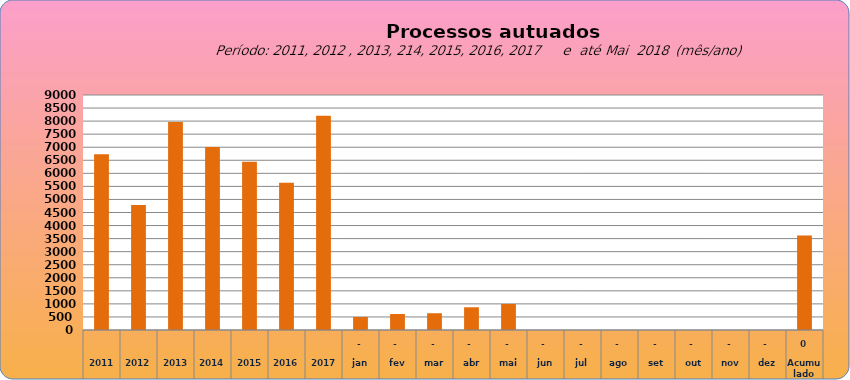
| Category | 6735 |
|---|---|
| 2011 | 6735 |
| 2012 | 4786 |
| 2013 | 7967 |
| 2014 | 7011 |
| 2015 | 6446 |
| 2016 | 5644 |
| 2017 | 8210 |
| jan | 498 |
| fev | 612 |
| mar | 642 |
| abr | 870 |
| mai | 995 |
| jun | 0 |
| jul | 0 |
| ago | 0 |
| set | 0 |
| out | 0 |
| nov | 0 |
| dez | 0 |
| Acumulado
 | 3617 |